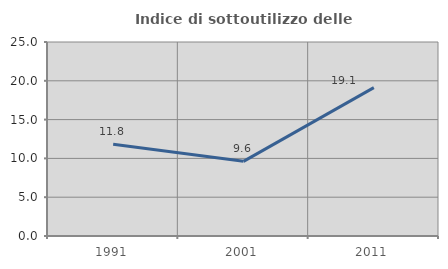
| Category | Indice di sottoutilizzo delle abitazioni  |
|---|---|
| 1991.0 | 11.836 |
| 2001.0 | 9.622 |
| 2011.0 | 19.124 |